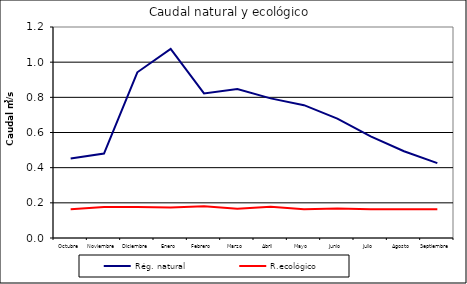
| Category | Rég. natural | R.ecológico |
|---|---|---|
| Octubre | 0.452 | 0.164 |
| Noviembre | 0.48 | 0.177 |
| Diciembre | 0.942 | 0.177 |
| Enero | 1.075 | 0.173 |
| Febrero | 0.822 | 0.18 |
| Marzo | 0.848 | 0.166 |
| Abril | 0.794 | 0.178 |
| Mayo | 0.755 | 0.164 |
| Junio | 0.679 | 0.168 |
| Julio | 0.578 | 0.164 |
| Agosto | 0.494 | 0.164 |
| Septiembre | 0.426 | 0.164 |